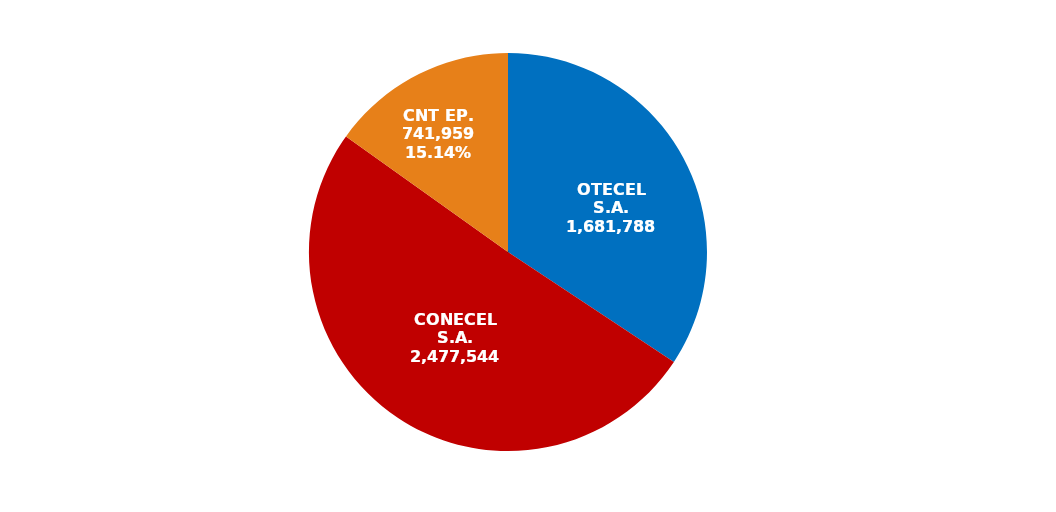
| Category | Series 0 |
|---|---|
| OTECEL S.A. | 1681788 |
| CONECEL S.A. | 2477544 |
| CNT EP. | 741959 |